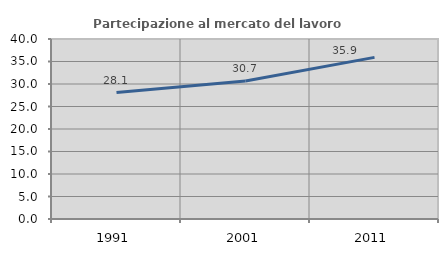
| Category | Partecipazione al mercato del lavoro  femminile |
|---|---|
| 1991.0 | 28.088 |
| 2001.0 | 30.673 |
| 2011.0 | 35.917 |